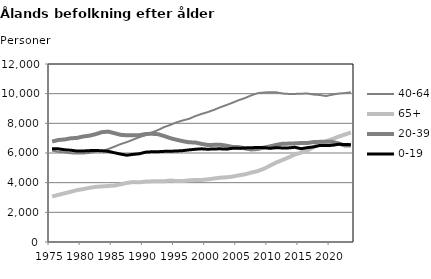
| Category | 40-64 | 65+ | 20-39 | 0-19 |
|---|---|---|---|---|
| 1975.0 | 6160 | 3067 | 6776 | 6285 |
| 1976.0 | 6077 | 3178 | 6877 | 6281 |
| 1977.0 | 6041 | 3283 | 6911 | 6217 |
| 1978.0 | 5979 | 3385 | 6992 | 6186 |
| 1979.0 | 5959 | 3499 | 7018 | 6132 |
| 1980.0 | 5965 | 3565 | 7116 | 6137 |
| 1981.0 | 6007 | 3651 | 7167 | 6159 |
| 1982.0 | 6086 | 3720 | 7271 | 6174 |
| 1983.0 | 6136 | 3746 | 7405 | 6148 |
| 1984.0 | 6264 | 3774 | 7443 | 6114 |
| 1985.0 | 6426 | 3806 | 7340 | 6019 |
| 1986.0 | 6599 | 3888 | 7226 | 5927 |
| 1987.0 | 6735 | 3980 | 7195 | 5851 |
| 1988.0 | 6899 | 4041 | 7198 | 5907 |
| 1989.0 | 7063 | 4022 | 7199 | 5947 |
| 1990.0 | 7198 | 4071 | 7279 | 6056 |
| 1991.0 | 7379 | 4088 | 7297 | 6083 |
| 1992.0 | 7545 | 4093 | 7269 | 6086 |
| 1993.0 | 7747 | 4099 | 7145 | 6111 |
| 1994.0 | 7896 | 4144 | 6999 | 6119 |
| 1995.0 | 8069 | 4106 | 6892 | 6135 |
| 1996.0 | 8196 | 4105 | 6796 | 6160 |
| 1997.0 | 8302 | 4158 | 6722 | 6210 |
| 1998.0 | 8489 | 4177 | 6708 | 6251 |
| 1999.0 | 8633 | 4177 | 6614 | 6282 |
| 2000.0 | 8757 | 4224 | 6542 | 6253 |
| 2001.0 | 8906 | 4280 | 6549 | 6273 |
| 2002.0 | 9080 | 4336 | 6559 | 6282 |
| 2003.0 | 9232 | 4361 | 6494 | 6260 |
| 2004.0 | 9391 | 4411 | 6409 | 6319 |
| 2005.0 | 9563 | 4494 | 6394 | 6315 |
| 2006.0 | 9707 | 4563 | 6310 | 6343 |
| 2007.0 | 9887 | 4677 | 6237 | 6352 |
| 2008.0 | 10030 | 4779 | 6268 | 6379 |
| 2009.0 | 10076 | 4933 | 6364 | 6361 |
| 2010.0 | 10100 | 5145 | 6448 | 6314 |
| 2011.0 | 10093 | 5358 | 6546 | 6358 |
| 2012.0 | 10012 | 5527 | 6622 | 6341 |
| 2013.0 | 9982 | 5705 | 6634 | 6345 |
| 2014.0 | 9983 | 5899 | 6649 | 6385 |
| 2015.0 | 9997 | 6023 | 6674 | 6289 |
| 2016.0 | 10012 | 6169 | 6672 | 6361 |
| 2017.0 | 9941 | 6401 | 6736 | 6411 |
| 2018.0 | 9911 | 6620 | 6752 | 6506 |
| 2019.0 | 9841 | 6786 | 6754 | 6503 |
| 2020.0 | 9931 | 6931 | 6750 | 6517 |
| 2021.0 | 10007 | 7100 | 6651 | 6586 |
| 2022.0 | 10037 | 7240 | 6511 | 6571 |
| 2023.0 | 10093 | 7384 | 6502 | 6562 |